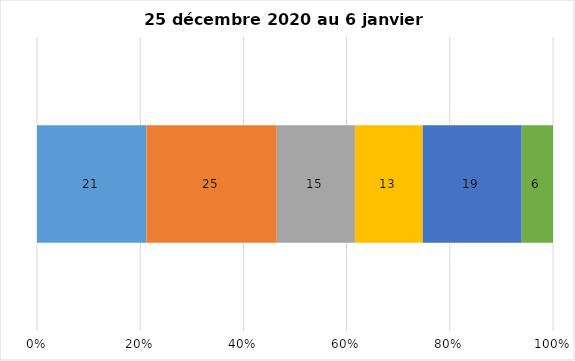
| Category | Plusieurs fois par jour | Une fois par jour | Quelques fois par semaine   | Une fois par semaine ou moins   |  Jamais   |  Je n’utilise pas les médias sociaux |
|---|---|---|---|---|---|---|
| 0 | 21 | 25 | 15 | 13 | 19 | 6 |